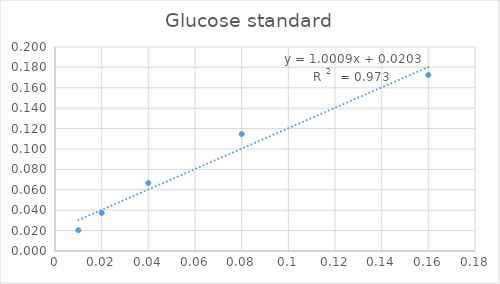
| Category | Series 0 |
|---|---|
| 0.01 | 0.02 |
| 0.02 | 0.037 |
| 0.04 | 0.067 |
| 0.08 | 0.115 |
| 0.16 | 0.173 |